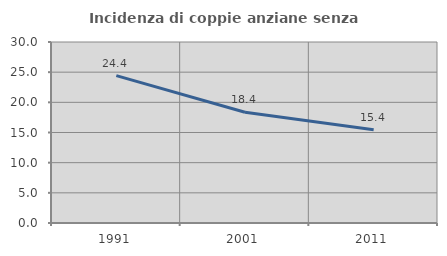
| Category | Incidenza di coppie anziane senza figli  |
|---|---|
| 1991.0 | 24.432 |
| 2001.0 | 18.367 |
| 2011.0 | 15.441 |